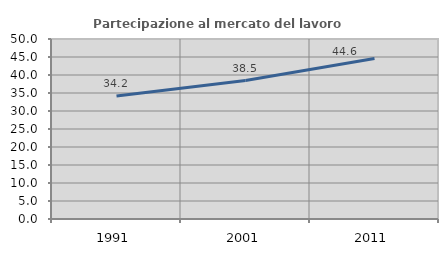
| Category | Partecipazione al mercato del lavoro  femminile |
|---|---|
| 1991.0 | 34.169 |
| 2001.0 | 38.467 |
| 2011.0 | 44.563 |